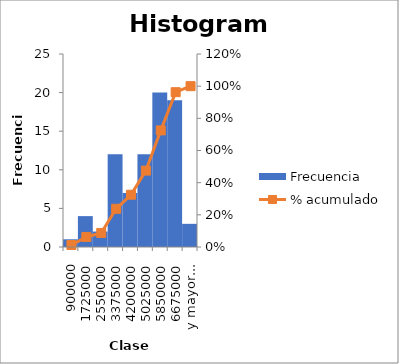
| Category | Frecuencia |
|---|---|
| 900000 | 1 |
| 1725000 | 4 |
| 2550000 | 2 |
| 3375000 | 12 |
| 4200000 | 7 |
| 5025000 | 12 |
| 5850000 | 20 |
| 6675000 | 19 |
| y mayor... | 3 |